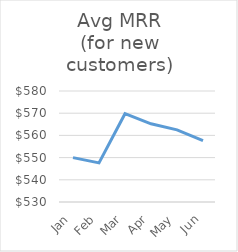
| Category | ARPA (Average MRR) for new custs |
|---|---|
| Jan | 550 |
| Feb | 547.619 |
| Mar | 569.767 |
| Apr | 565.217 |
| May | 562.5 |
| Jun | 557.692 |